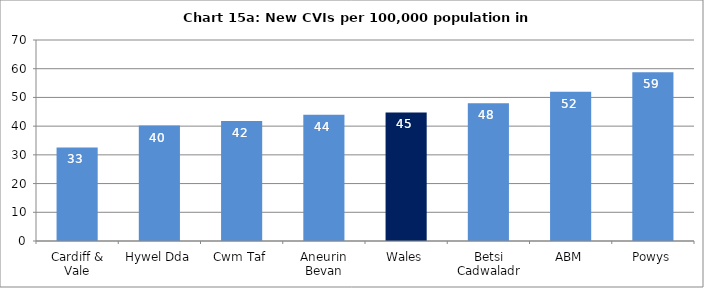
| Category | Chart 15a: New CVIs per 100,000 population in 2015-16 |
|---|---|
| Cardiff & Vale | 32.594 |
| Hywel Dda | 40.185 |
| Cwm Taf | 41.788 |
| Aneurin Bevan | 44.002 |
| Wales | 44.787 |
| Betsi Cadwaladr | 47.95 |
| ABM | 51.954 |
| Powys | 58.805 |